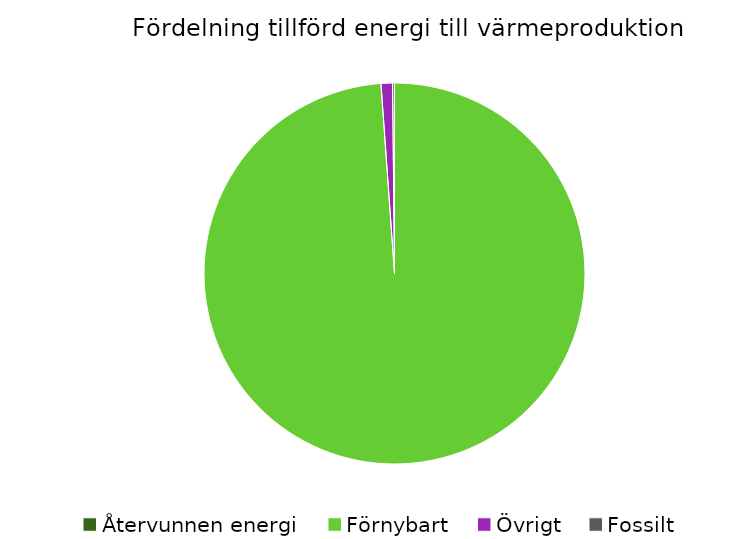
| Category | Fördelning värmeproduktion |
|---|---|
| Återvunnen energi | 0 |
| Förnybart | 0.989 |
| Övrigt | 0.01 |
| Fossilt | 0.002 |